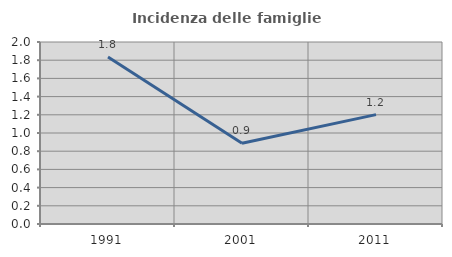
| Category | Incidenza delle famiglie numerose |
|---|---|
| 1991.0 | 1.835 |
| 2001.0 | 0.888 |
| 2011.0 | 1.202 |